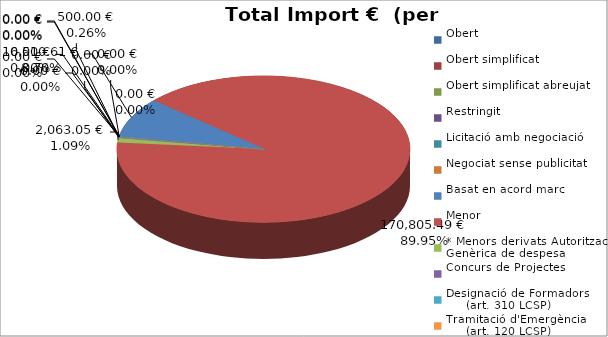
| Category | Total preu
(amb IVA) |
|---|---|
| Obert | 0 |
| Obert simplificat | 0 |
| Obert simplificat abreujat | 0 |
| Restringit | 0 |
| Licitació amb negociació | 0 |
| Negociat sense publicitat | 0 |
| Basat en acord marc | 16510.61 |
| Menor | 170805.49 |
| * Menors derivats Autorització Genèrica de despesa | 2063.05 |
| Concurs de Projectes | 0 |
| Designació de Formadors
     (art. 310 LCSP) | 500 |
| Tramitació d'Emergència
     (art. 120 LCSP) | 0 |